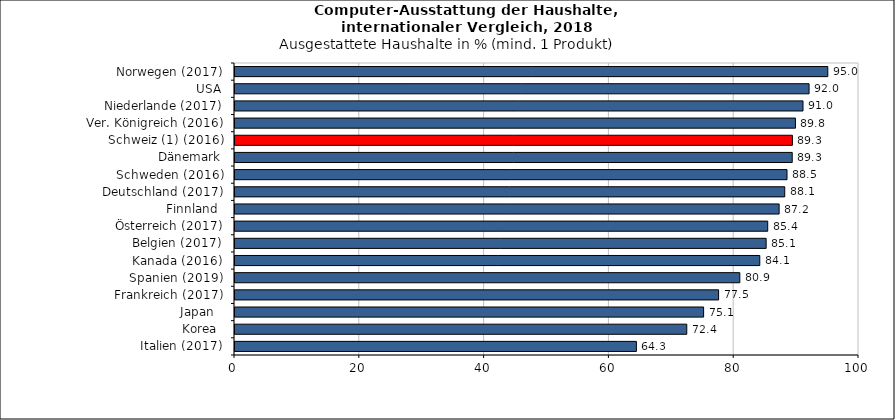
| Category | Italien (2017) |
|---|---|
| Italien (2017) | 64.326 |
| Korea  | 72.4 |
| Japan   | 75.1 |
| Frankreich (2017) | 77.5 |
| Spanien (2019) | 80.9 |
| Kanada (2016) | 84.1 |
| Belgien (2017) | 85.119 |
| Österreich (2017) | 85.373 |
| Finnland  | 87.2 |
| Deutschland (2017) | 88.1 |
| Schweden (2016) | 88.463 |
| Dänemark | 89.3 |
| Schweiz (1) (2016) | 89.33 |
| Ver. Königreich (2016) | 89.816 |
| Niederlande (2017) | 91.026 |
| USA | 92 |
| Norwegen (2017) | 95 |